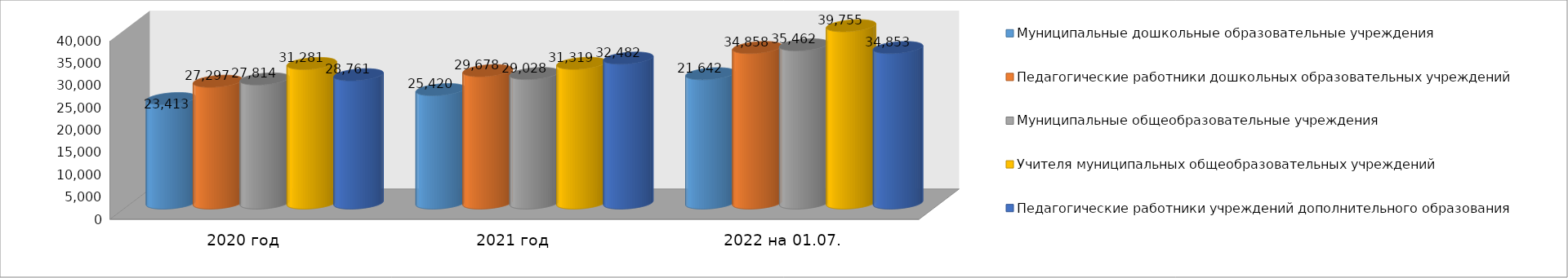
| Category | Муниципальные дошкольные образовательные учреждения | Педагогические работники дошкольных образовательных учреждений | Муниципальные общеобразовательные учреждения | Учителя муниципальных общеобразовательных учреждений | Педагогические работники учреждений дополнительного образования |
|---|---|---|---|---|---|
| 2020 год | 23413 | 27297 | 27814 | 31281 | 28761 |
| 2021 год | 25420 | 29678 | 29028 | 31319 | 32482 |
| 2022 на 01.07. | 28981 | 34858 | 35462 | 39755 | 34853 |